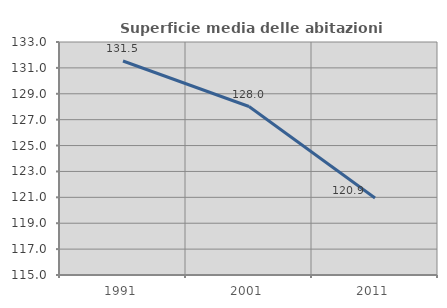
| Category | Superficie media delle abitazioni occupate |
|---|---|
| 1991.0 | 131.531 |
| 2001.0 | 128.016 |
| 2011.0 | 120.944 |